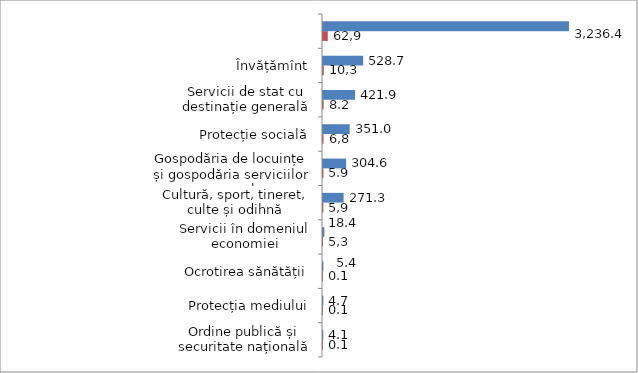
| Category | Series 1 | Series 0 |
|---|---|---|
| Ordine publică și securitate națională | 0.1 | 4.1 |
| Protecția mediului | 0.1 | 4.7 |
| Ocrotirea sănătății | 0.1 | 5.4 |
| Servicii în domeniul economiei | 0.4 | 18.4 |
| Cultură, sport, tineret, culte și odihnă | 5.3 | 271.3 |
| Gospodăria de locuințe și gospodăria serviciilor comunale | 5.9 | 304.6 |
| Protecție socială | 6.8 | 351 |
| Servicii de stat cu destinație generală | 8.2 | 421.9 |
| Învățămînt | 10.3 | 528.7 |